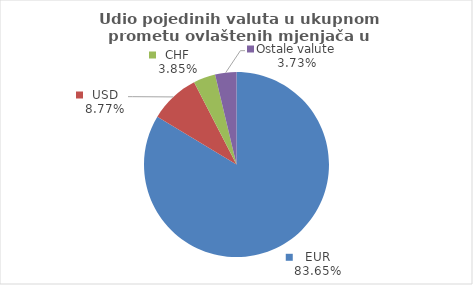
| Category | Series 0 |
|---|---|
| EUR | 83.653 |
| USD | 8.768 |
| CHF | 3.852 |
| Ostale valute | 3.728 |